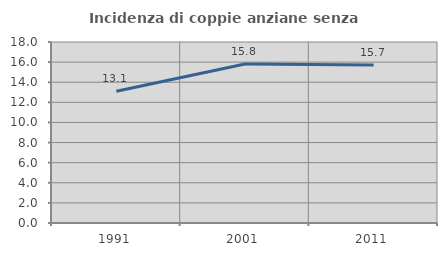
| Category | Incidenza di coppie anziane senza figli  |
|---|---|
| 1991.0 | 13.099 |
| 2001.0 | 15.815 |
| 2011.0 | 15.702 |